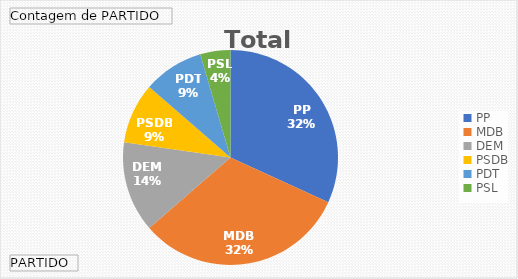
| Category | Total |
|---|---|
| PP | 7 |
| MDB | 7 |
| DEM | 3 |
| PSDB | 2 |
| PDT | 2 |
| PSL | 1 |